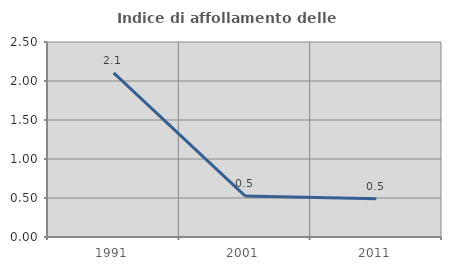
| Category | Indice di affollamento delle abitazioni  |
|---|---|
| 1991.0 | 2.104 |
| 2001.0 | 0.526 |
| 2011.0 | 0.49 |